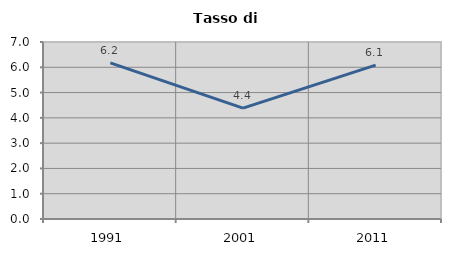
| Category | Tasso di disoccupazione   |
|---|---|
| 1991.0 | 6.173 |
| 2001.0 | 4.384 |
| 2011.0 | 6.088 |